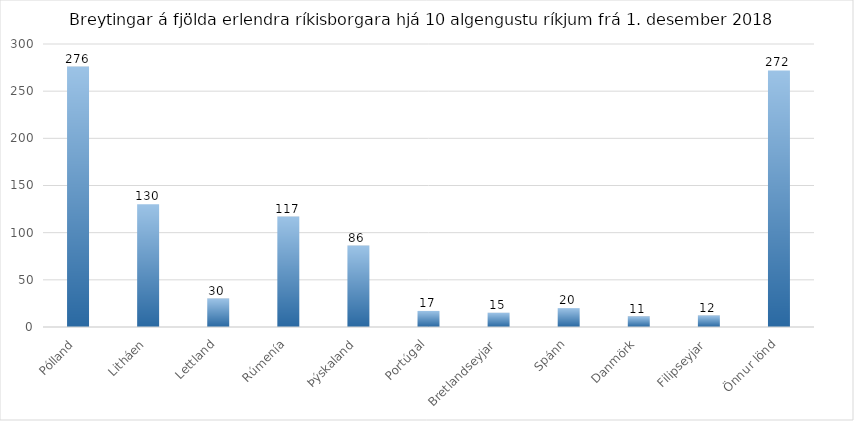
| Category | Series 0 |
|---|---|
| Pólland | 276 |
| Litháen | 130 |
| Lettland | 30 |
| Rúmenía | 117 |
| Þýskaland | 86 |
| Portúgal | 17 |
| Bretlandseyjar | 15 |
| Spánn | 20 |
| Danmörk | 11 |
| Filipseyjar | 12 |
| Önnur lönd | 272 |